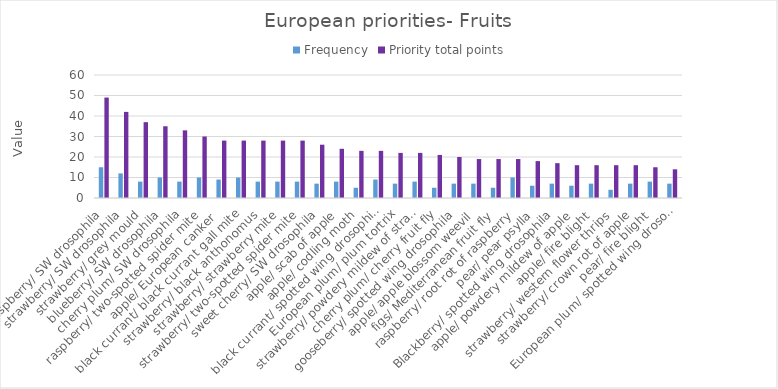
| Category | Frequency | Priority total points |
|---|---|---|
| raspberry/ SW drosophila | 15 | 49 |
| strawberry/ SW drosophila | 12 | 42 |
| strawberry/ grey mould | 8 | 37 |
| blueberry/ SW drosophila | 10 | 35 |
| cherry plum/ SW drosophila | 8 | 33 |
| raspberry/ two-spotted spider mite | 10 | 30 |
| apple/ European canker  | 9 | 28 |
| black currant/ black currant gall mite | 10 | 28 |
| strawberry/ black anthonomus | 8 | 28 |
| strawberry/ strawberry mite | 8 | 28 |
| strawberry/ two-spotted spider mite | 8 | 28 |
| sweet cherry/ SW drosophila | 7 | 26 |
| apple/ scab of apple | 8 | 24 |
| apple/ codling moth | 5 | 23 |
| black currant/ spotted wing drosophila | 9 | 23 |
| European plum/ plum tortrix | 7 | 22 |
| strawberry/ powdery mildew of strawberry | 8 | 22 |
| cherry plum/ cherry fruit fly | 5 | 21 |
| gooseberry/ spotted wing drosophila | 7 | 20 |
| apple/ apple blossom weevil | 7 | 19 |
| figs/ Mediterranean fruit fly | 5 | 19 |
| raspberry/ root rot of raspberry | 10 | 19 |
| pear/ pear psylla | 6 | 18 |
| Blackberry/ spotted wing drosophila | 7 | 17 |
| apple/ powdery mildew of apple | 6 | 16 |
| apple/ fire blight | 7 | 16 |
| strawberry/ western flower thrips | 4 | 16 |
| strawberry/ crown rot of apple | 7 | 16 |
| pear/ fire blight | 8 | 15 |
| European plum/ spotted wing drosophila | 7 | 14 |